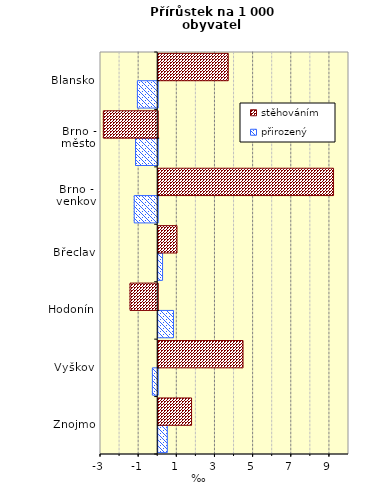
| Category | přirozený | stěhováním |
|---|---|---|
| Znojmo | 0.477 | 1.748 |
| Vyškov | -0.279 | 4.446 |
| Hodonín | 0.8 | -1.452 |
| Břeclav | 0.226 | 0.984 |
| Brno - venkov | -1.232 | 9.19 |
| Brno - město | -1.163 | -2.85 |
| Blansko | -1.065 | 3.67 |